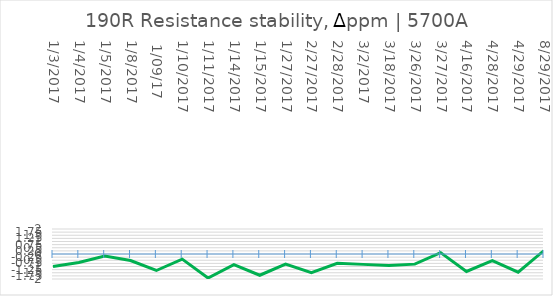
| Category | Series 0 |
|---|---|
| 1/3/2017 | -1 |
| 1/4/2017 | -0.68 |
| 1/5/2017 | -0.17 |
| 1/8/2017 | -0.52 |
|  1/09/17 | -1.32 |
| 1/10/2017 | -0.41 |
| 1/11/2017 | -1.92 |
| 1/14/2017 | -0.85 |
| 1/15/2017 | -1.7 |
| 1/27/2017 | -0.81 |
| 2/27/2017 | -1.49 |
| 2/28/2017 | -0.74 |
| 3/2/2017 | -0.83 |
| 3/18/2017 | -0.91 |
| 3/26/2017 | -0.81 |
| 3/27/2017 | 0.11 |
| 4/16/2017 | -1.4 |
| 4/28/2017 | -0.53 |
| 4/29/2017 | -1.45 |
| 8/29/2017 | 0.28 |